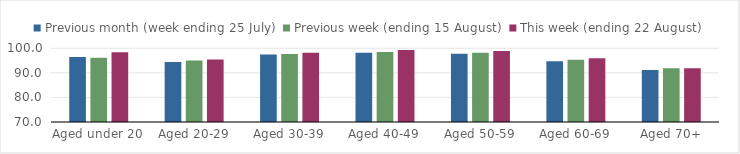
| Category | Previous month (week ending 25 July) | Previous week (ending 15 August) | This week (ending 22 August) |
|---|---|---|---|
| Aged under 20 | 96.486 | 96.166 | 98.356 |
| Aged 20-29 | 94.446 | 95.049 | 95.418 |
| Aged 30-39 | 97.479 | 97.631 | 98.201 |
| Aged 40-49 | 98.212 | 98.517 | 99.256 |
| Aged 50-59 | 97.769 | 98.175 | 98.892 |
| Aged 60-69 | 94.688 | 95.325 | 95.907 |
| Aged 70+ | 91.129 | 91.824 | 91.923 |